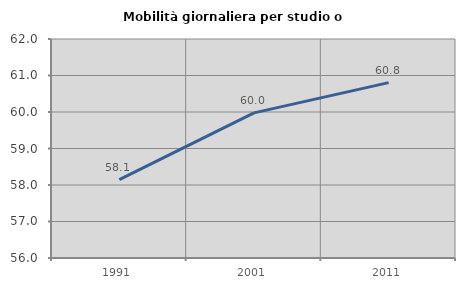
| Category | Mobilità giornaliera per studio o lavoro |
|---|---|
| 1991.0 | 58.15 |
| 2001.0 | 59.976 |
| 2011.0 | 60.804 |